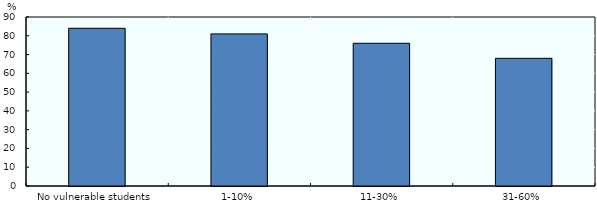
| Category | Series 0 |
|---|---|
| No vulnerable students | 84 |
| 1-10% | 81 |
| 11-30% | 76 |
| 31-60% | 68 |